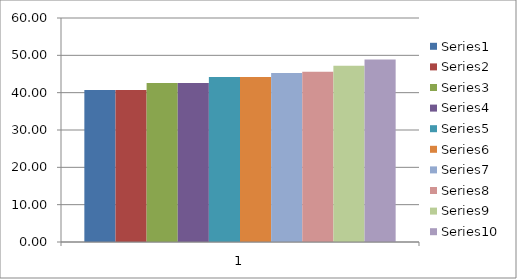
| Category | Series 0 | Series 1 | Series 2 | Series 3 | Series 4 | Series 5 | Series 6 | Series 7 | Series 8 | Series 9 |
|---|---|---|---|---|---|---|---|---|---|---|
| 0 | 40.7 | 40.7 | 42.6 | 42.6 | 44.2 | 44.2 | 45.3 | 45.6 | 47.2 | 48.9 |